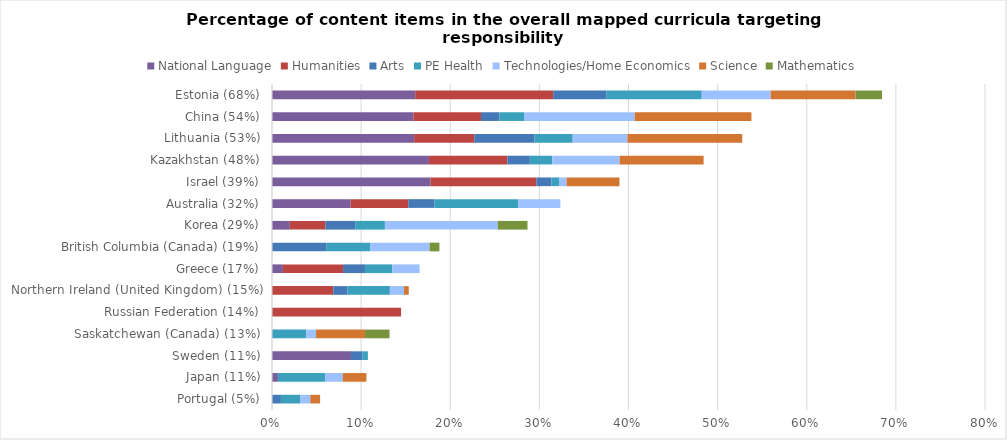
| Category | National Language | Humanities | Arts | PE Health | Technologies/Home Economics | Science | Mathematics |
|---|---|---|---|---|---|---|---|
| Portugal (5%) | 0 | 0 | 0.01 | 0.022 | 0.011 | 0.011 | 0 |
| Japan (11%) | 0.007 | 0 | 0 | 0.053 | 0.02 | 0.026 | 0 |
| Sweden (11%) | 0.089 | 0 | 0.013 | 0.006 | 0 | 0 | 0 |
| Saskatchewan (Canada) (13%) | 0 | 0 | 0 | 0.038 | 0.011 | 0.055 | 0.027 |
| Russian Federation (14%) | 0 | 0.145 | 0 | 0 | 0 | 0 | 0 |
| Northern Ireland (United Kingdom) (15%) | 0 | 0.069 | 0.016 | 0.048 | 0.016 | 0.005 | 0 |
| Greece (17%) | 0.012 | 0.067 | 0.025 | 0.031 | 0.031 | 0 | 0 |
| British Columbia (Canada) (19%) | 0 | 0 | 0.061 | 0.05 | 0.066 | 0 | 0.011 |
| Korea (29%) | 0.02 | 0.04 | 0.033 | 0.033 | 0.127 | 0 | 0.033 |
| Australia (32%) | 0.088 | 0.065 | 0.029 | 0.094 | 0.047 | 0 | 0 |
| Israel (39%) | 0.178 | 0.119 | 0.017 | 0.008 | 0.008 | 0.059 | 0 |
| Kazakhstan (48%) | 0.176 | 0.088 | 0.025 | 0.025 | 0.075 | 0.094 | 0 |
| Lithuania (53%) | 0.16 | 0.067 | 0.067 | 0.043 | 0.061 | 0.129 | 0 |
| China (54%) | 0.159 | 0.076 | 0.021 | 0.028 | 0.124 | 0.131 | 0 |
| Estonia (68%) | 0.161 | 0.155 | 0.06 | 0.107 | 0.077 | 0.095 | 0.03 |